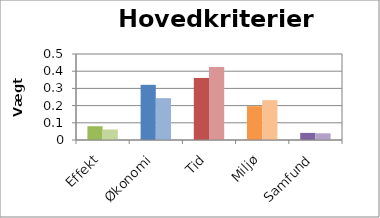
| Category | Vægt 1 | Vægt 2 |
|---|---|---|
| Effekt | 0.08 | 0.061 |
| Økonomi | 0.321 | 0.243 |
| Tid | 0.361 | 0.425 |
| Miljø | 0.197 | 0.232 |
| Samfund | 0.041 | 0.039 |